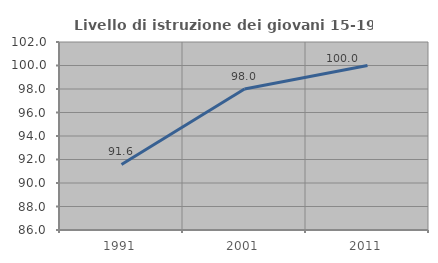
| Category | Livello di istruzione dei giovani 15-19 anni |
|---|---|
| 1991.0 | 91.579 |
| 2001.0 | 98 |
| 2011.0 | 100 |